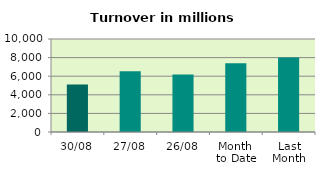
| Category | Series 0 |
|---|---|
| 30/08 | 5107.183 |
| 27/08 | 6527.29 |
| 26/08 | 6190.312 |
| Month 
to Date | 7382.256 |
| Last
Month | 8019.786 |